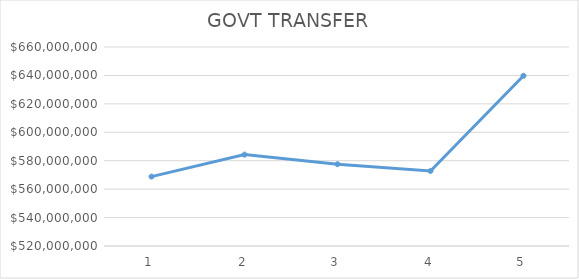
| Category | Series 0 |
|---|---|
| 0 | 568826000 |
| 1 | 584294000 |
| 2 | 577547000 |
| 3 | 572800000 |
| 4 | 639766000 |